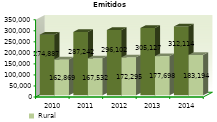
| Category | Urbano | Rural |
|---|---|---|
| 2010.0 | 274887 | 162869 |
| 2011.0 | 287242 | 167532 |
| 2012.0 | 296102 | 172295 |
| 2013.0 | 305127 | 177698 |
| 2014.0 | 312114 | 183194 |